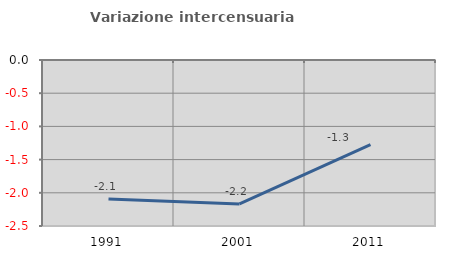
| Category | Variazione intercensuaria annua |
|---|---|
| 1991.0 | -2.092 |
| 2001.0 | -2.167 |
| 2011.0 | -1.276 |